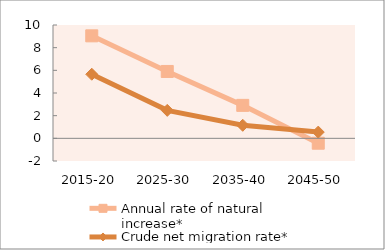
| Category | Annual rate of natural increase* | Crude net migration rate* |
|---|---|---|
| 2015-20 | 9.044 | 5.655 |
| 2025-30 | 5.901 | 2.468 |
| 2035-40 | 2.909 | 1.151 |
| 2045-50 | -0.43 | 0.55 |